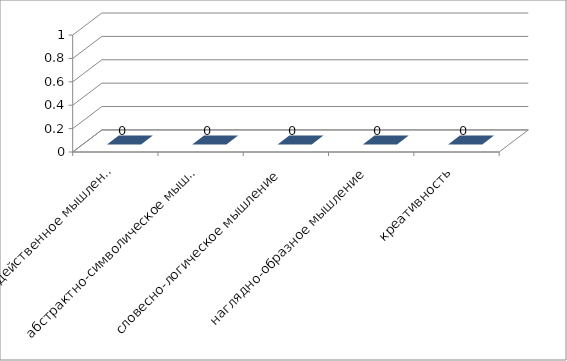
| Category | Series 0 |
|---|---|
| предметно-действенное мышление | 0 |
| абстрактно-символическое мышление | 0 |
| словесно-логическое мышление | 0 |
| наглядно-образное мышление | 0 |
| креативность | 0 |